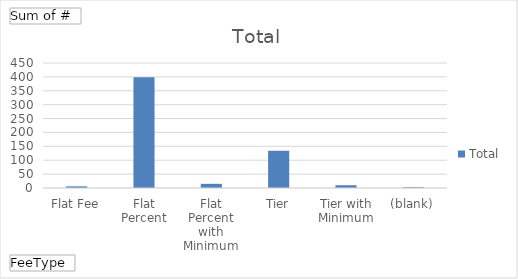
| Category | Total |
|---|---|
| Flat Fee | 6 |
| Flat Percent | 399 |
| Flat Percent with Minimum | 15 |
| Tier | 134 |
| Tier with Minimum | 10 |
| (blank) | 3 |